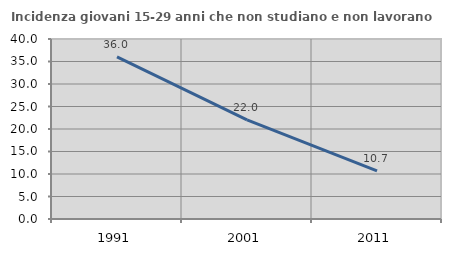
| Category | Incidenza giovani 15-29 anni che non studiano e non lavorano  |
|---|---|
| 1991.0 | 36.022 |
| 2001.0 | 22.034 |
| 2011.0 | 10.714 |